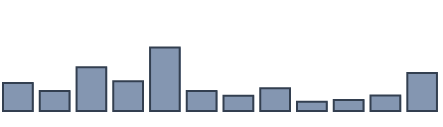
| Category | Series 0 |
|---|---|
| 0 | 8.865 |
| 1 | 6.342 |
| 2 | 13.764 |
| 3 | 9.384 |
| 4 | 20.01 |
| 5 | 6.309 |
| 6 | 4.811 |
| 7 | 7.194 |
| 8 | 2.948 |
| 9 | 3.507 |
| 10 | 4.885 |
| 11 | 11.982 |